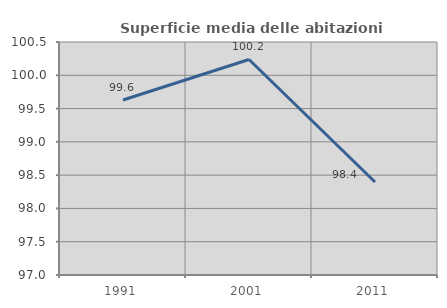
| Category | Superficie media delle abitazioni occupate |
|---|---|
| 1991.0 | 99.629 |
| 2001.0 | 100.237 |
| 2011.0 | 98.396 |